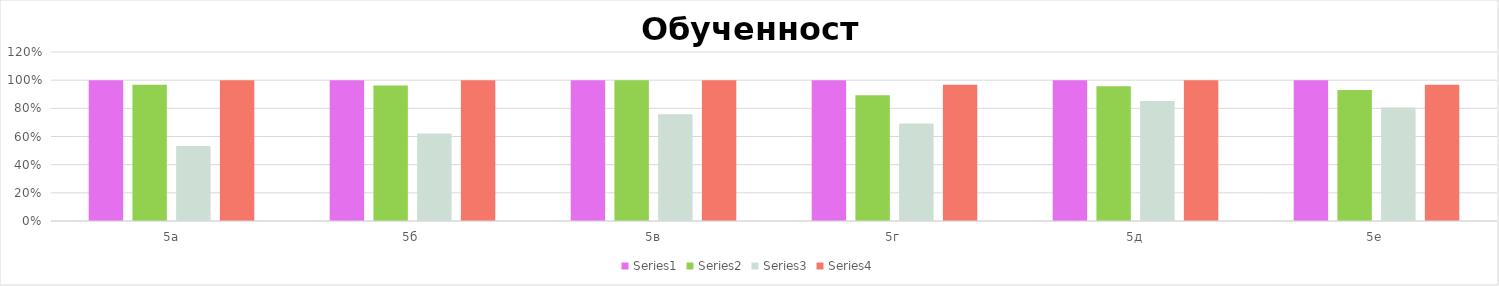
| Category | Series 0 | Series 1 | Series 2 | Series 3 | Series 4 |
|---|---|---|---|---|---|
| 5а |  | 1 | 0.968 | 0.533 | 1 |
| 5б |  | 1 | 0.962 | 0.621 | 1 |
| 5в |  | 1 | 1 | 0.759 | 1 |
| 5г |  | 1 | 0.893 | 0.692 | 0.967 |
| 5д |  | 1 | 0.957 | 0.852 | 1 |
| 5е |  | 1 | 0.931 | 0.806 | 0.967 |